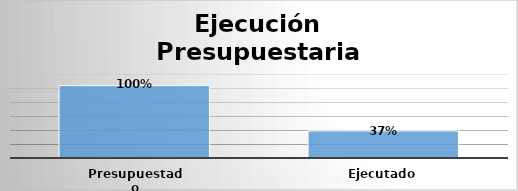
| Category | Series 0 |
|---|---|
| Presupuestado | 25854080191 |
| Ejecutado | 9656896718 |